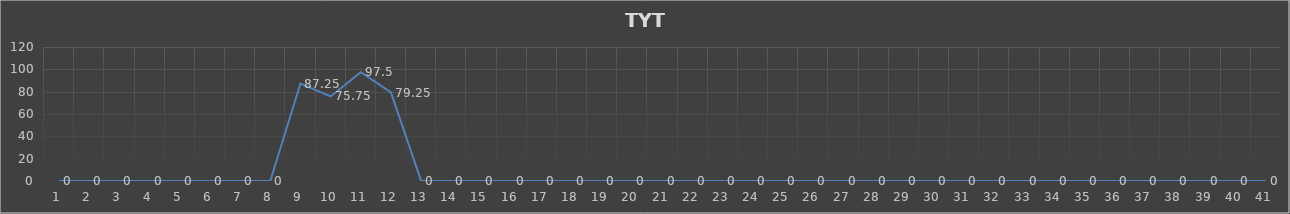
| Category | Series 0 |
|---|---|
| 0 | 0 |
| 1 | 0 |
| 2 | 0 |
| 3 | 0 |
| 4 | 0 |
| 5 | 0 |
| 6 | 0 |
| 7 | 0 |
| 8 | 87.25 |
| 9 | 75.75 |
| 10 | 97.5 |
| 11 | 79.25 |
| 12 | 0 |
| 13 | 0 |
| 14 | 0 |
| 15 | 0 |
| 16 | 0 |
| 17 | 0 |
| 18 | 0 |
| 19 | 0 |
| 20 | 0 |
| 21 | 0 |
| 22 | 0 |
| 23 | 0 |
| 24 | 0 |
| 25 | 0 |
| 26 | 0 |
| 27 | 0 |
| 28 | 0 |
| 29 | 0 |
| 30 | 0 |
| 31 | 0 |
| 32 | 0 |
| 33 | 0 |
| 34 | 0 |
| 35 | 0 |
| 36 | 0 |
| 37 | 0 |
| 38 | 0 |
| 39 | 0 |
| 40 | 0 |